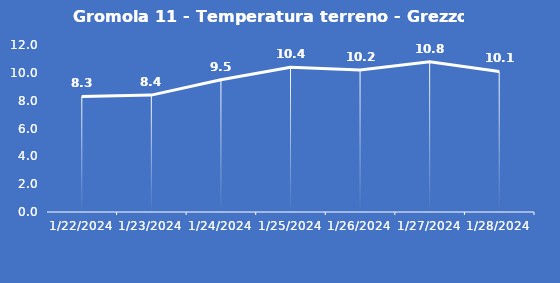
| Category | Gromola 11 - Temperatura terreno - Grezzo (°C) |
|---|---|
| 1/22/24 | 8.3 |
| 1/23/24 | 8.4 |
| 1/24/24 | 9.5 |
| 1/25/24 | 10.4 |
| 1/26/24 | 10.2 |
| 1/27/24 | 10.8 |
| 1/28/24 | 10.1 |